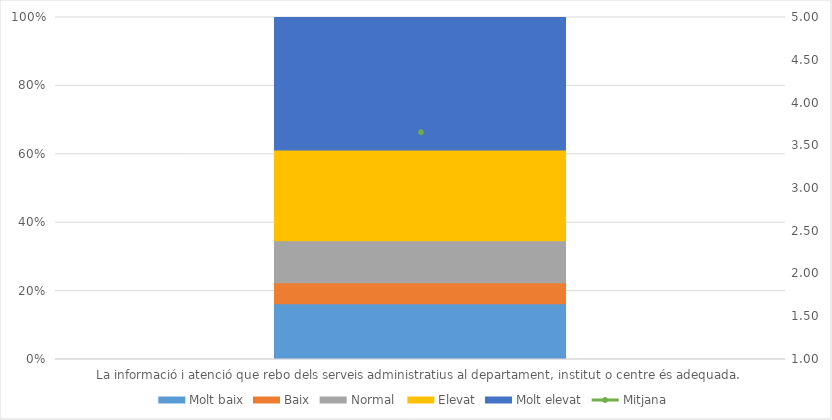
| Category | Molt baix | Baix | Normal  | Elevat | Molt elevat |
|---|---|---|---|---|---|
| La informació i atenció que rebo dels serveis administratius al departament, institut o centre és adequada. | 8 | 3 | 6 | 13 | 19 |